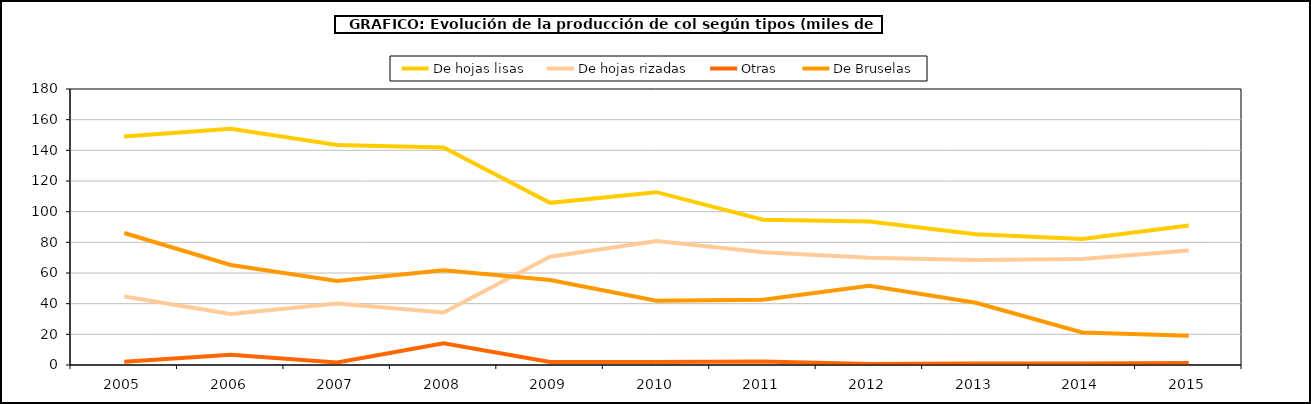
| Category | De hojas lisas | De hojas rizadas | Otras | De Bruselas |
|---|---|---|---|---|
| 2005.0 | 149.075 | 44.668 | 2.196 | 86.064 |
| 2006.0 | 153.992 | 33.233 | 6.728 | 65.206 |
| 2007.0 | 143.47 | 40.049 | 1.632 | 54.822 |
| 2008.0 | 141.867 | 34.216 | 14.143 | 61.764 |
| 2009.0 | 105.759 | 70.664 | 2.005 | 55.438 |
| 2010.0 | 112.708 | 80.922 | 1.972 | 41.958 |
| 2011.0 | 94.724 | 73.591 | 2.237 | 42.575 |
| 2012.0 | 93.549 | 70.008 | 0.731 | 51.596 |
| 2013.0 | 85.207 | 68.536 | 0.965 | 40.593 |
| 2014.0 | 82.165 | 69.098 | 1.025 | 21.166 |
| 2015.0 | 91.025 | 74.746 | 1.371 | 19.06 |